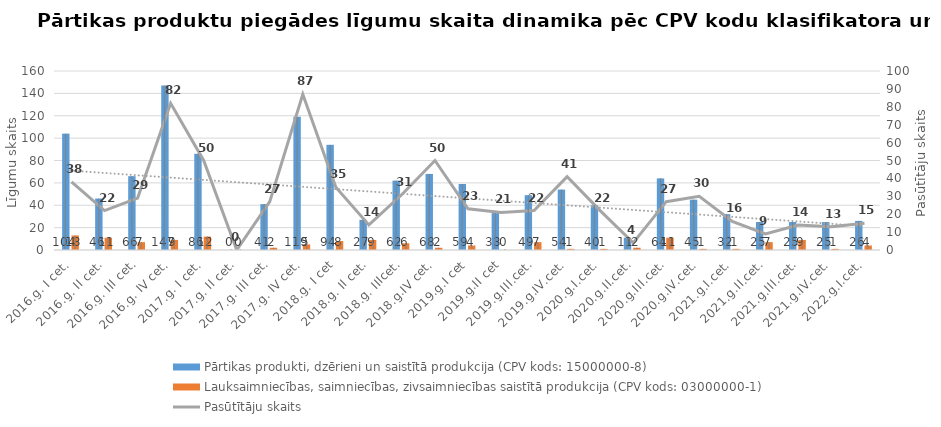
| Category | Pārtikas produkti, dzērieni un saistītā produkcija (CPV kods: 15000000-8) | Lauksaimniecības, saimniecības, zivsaimniecības saistītā produkcija (CPV kods: 03000000-1) |
|---|---|---|
| 2016.g. I cet. | 104 | 13 |
| 2016.g. II cet. | 46 | 11 |
| 2016.g. III cet. | 66 | 7 |
| 2016.g. IV cet. | 147 | 9 |
| 2017.g. I cet. | 86 | 12 |
| 2017.g. II cet. | 0 | 0 |
| 2017.g. III cet. | 41 | 2 |
| 2017.g. IV cet. | 119 | 5 |
| 2018.g. I cet | 94 | 8 |
| 2018.g. II cet. | 27 | 9 |
| 2018.g. IIIcet. | 62 | 6 |
| 2018.g.IV cet. | 68 | 2 |
| 2019.g.I cet | 59 | 4 |
| 2019.g.II cet | 33 | 0 |
| 2019.g.III.cet. | 49 | 7 |
| 2019.g.IV.cet. | 54 | 1 |
| 2020.g.I.cet. | 40 | 1 |
| 2020.g.II.cet. | 11 | 2 |
| 2020.g.III.cet. | 64 | 11 |
| 2020.g.IV.cet. | 45 | 1 |
| 2021.g.I.cet. | 32 | 1 |
| 2021.g.II.cet. | 25 | 7 |
| 2021.g.III.cet. | 25 | 9 |
| 2021.g.IV.cet. | 25 | 1 |
| 2022.g.I.cet. | 26 | 4 |